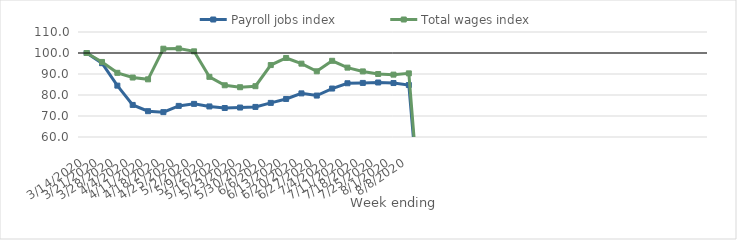
| Category | Payroll jobs index | Total wages index |
|---|---|---|
| 14/03/2020 | 100 | 100 |
| 21/03/2020 | 95.15 | 95.744 |
| 28/03/2020 | 84.46 | 90.56 |
| 04/04/2020 | 75.271 | 88.318 |
| 11/04/2020 | 72.292 | 87.459 |
| 18/04/2020 | 71.843 | 102.043 |
| 25/04/2020 | 74.807 | 102.147 |
| 02/05/2020 | 75.77 | 100.794 |
| 09/05/2020 | 74.546 | 88.648 |
| 16/05/2020 | 73.806 | 84.635 |
| 23/05/2020 | 74.031 | 83.702 |
| 30/05/2020 | 74.32 | 84.194 |
| 06/06/2020 | 76.245 | 94.254 |
| 13/06/2020 | 78.115 | 97.627 |
| 20/06/2020 | 80.772 | 94.927 |
| 27/06/2020 | 79.729 | 91.285 |
| 04/07/2020 | 83.078 | 96.286 |
| 11/07/2020 | 85.593 | 93.029 |
| 18/07/2020 | 85.748 | 91.233 |
| 25/07/2020 | 85.948 | 90.007 |
| 01/08/2020 | 85.695 | 89.698 |
| 08/08/2020 | 84.741 | 90.299 |